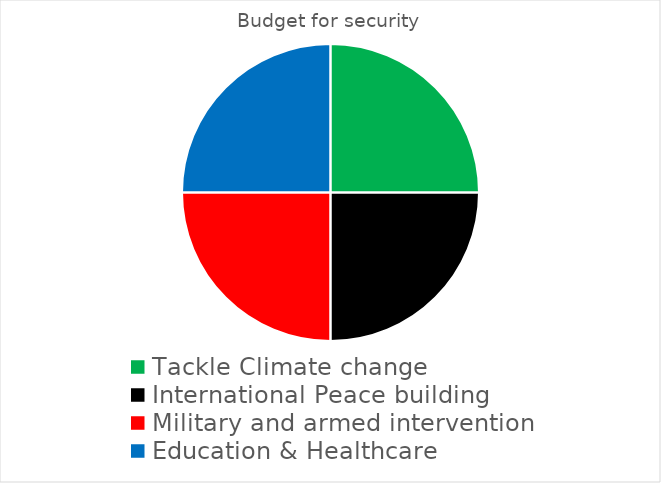
| Category | Budget for security |
|---|---|
| Tackle Climate change | 25 |
| International Peace building | 25 |
| Military and armed intervention | 25 |
| Education & Healthcare | 25 |